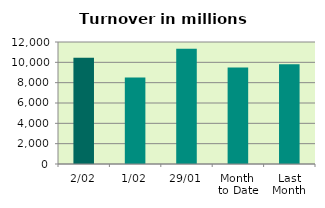
| Category | Series 0 |
|---|---|
| 2/02 | 10463.059 |
| 1/02 | 8508.502 |
| 29/01 | 11346.896 |
| Month 
to Date | 9485.781 |
| Last
Month | 9809.456 |